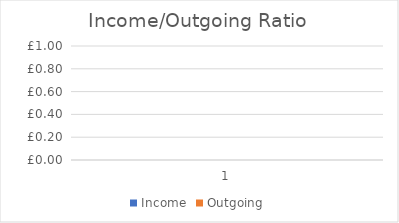
| Category | Income | Outgoing |
|---|---|---|
| 0 | 0 | 0 |